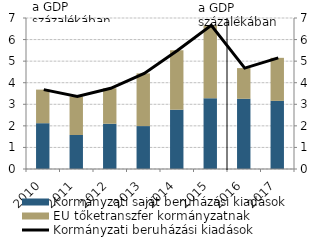
| Category | Kormányzati saját beruházási kiadások | EU tőketranszfer kormányzatnak |
|---|---|---|
| 2010.0 | 2.123 | 1.557 |
| 2011.0 | 1.576 | 1.786 |
| 2012.0 | 2.098 | 1.645 |
| 2013.0 | 1.99 | 2.443 |
| 2014.0 | 2.749 | 2.755 |
| 2015.0 | 3.283 | 3.377 |
| 2016.0 | 3.255 | 1.423 |
| 2017.0 | 3.159 | 1.995 |